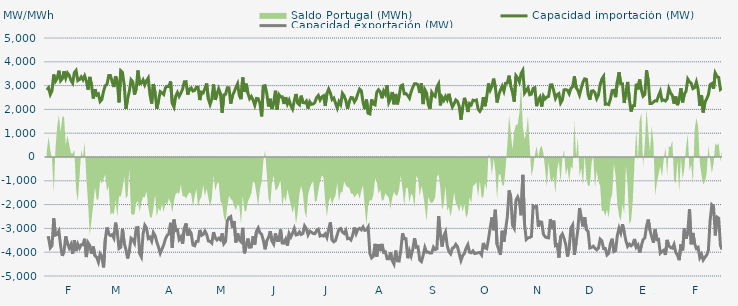
| Category | Capacidad importación (MW) | Capacidad exportación (MW) |
|---|---|---|
| 0 | 2816.458 | -3403.125 |
| 1900-01-01 | 2908.75 | -3388.125 |
| 1900-01-02 | 2628.458 | -3817.5 |
| 1900-01-03 | 2784.5 | -3729.375 |
| 1900-01-04 | 3466.875 | -2575.375 |
| 1900-01-05 | 3180 | -3284.375 |
| 1900-01-06 | 3301.25 | -3251.25 |
| 1900-01-07 | 3624.375 | -3114.375 |
| 1900-01-08 | 3203.333 | -3733.125 |
| 1900-01-09 | 3288.125 | -4155 |
| 1900-01-10 | 3606.25 | -3943.125 |
| 1900-01-11 | 3313.75 | -3335.625 |
| 1900-01-12 | 3531.417 | -3646.875 |
| 1900-01-13 | 3433.125 | -3826.875 |
| 1900-01-14 | 3223.542 | -3673.333 |
| 1900-01-15 | 3103.75 | -4066.875 |
| 1900-01-16 | 3546.25 | -3496.875 |
| 1900-01-17 | 3638.5 | -3952.5 |
| 1900-01-18 | 3210 | -3661.875 |
| 1900-01-19 | 3255.417 | -3826.875 |
| 1900-01-20 | 3367.5 | -3690 |
| 1900-01-21 | 3244.5 | -3684.375 |
| 1900-01-22 | 3411.458 | -3435 |
| 1900-01-23 | 3192.708 | -4203.75 |
| 1900-01-24 | 2825 | -3605.625 |
| 1900-01-25 | 3365.667 | -3718.625 |
| 1900-01-26 | 3014.375 | -4063.125 |
| 1900-01-27 | 2458.292 | -3762 |
| 1900-01-28 | 2845.5 | -4151.25 |
| 1900-01-29 | 2597.292 | -4215 |
| 1900-01-30 | 2650.375 | -4415.625 |
| 1900-01-31 | 2331.042 | -4066.875 |
| 1900-02-01 | 2415.625 | -4185 |
| 1900-02-02 | 2763.875 | -4638.75 |
| 1900-02-03 | 2996.042 | -3465 |
| 1900-02-04 | 3054.375 | -2960.625 |
| 1900-02-05 | 3421.875 | -3238.875 |
| 1900-02-06 | 3422.25 | -3301.458 |
| 1900-02-07 | 3168.75 | -3257.708 |
| 1900-02-08 | 2940.75 | -3407.5 |
| 1900-02-09 | 3391.875 | -2758.75 |
| 1900-02-10 | 3159.375 | -3175.208 |
| 1900-02-11 | 2294.792 | -3843.75 |
| 1900-02-12 | 3620.625 | -3793.125 |
| 1900-02-13 | 3550.208 | -3016.875 |
| 1900-02-14 | 3036.458 | -3616.875 |
| 1900-02-15 | 2023.333 | -3886.25 |
| 1900-02-16 | 2440.208 | -4263.75 |
| 1900-02-17 | 2764.167 | -3943.125 |
| 1900-02-18 | 3245.625 | -3410.667 |
| 1900-02-19 | 3161.25 | -3470.625 |
| 1900-02-20 | 2621.458 | -3614.625 |
| 1900-02-21 | 2861.25 | -2975.958 |
| 1900-02-22 | 3635.217 | -2962.391 |
| 1900-02-23 | 3071.083 | -4052.75 |
| 1900-02-24 | 3103.625 | -4196.25 |
| 1900-02-25 | 3238.125 | -3235.75 |
| 1900-02-26 | 3031.875 | -2868.708 |
| 1900-02-27 | 3202.5 | -2981.292 |
| 1900-02-28 | 3320.625 | -3422.292 |
| 1900-02-28 | 2615.625 | -3370.417 |
| 1900-03-01 | 2244.375 | -3535.625 |
| 1900-03-02 | 3067.5 | -3176.25 |
| 1900-03-03 | 2692.458 | -3306.875 |
| 1900-03-04 | 2025 | -3576.042 |
| 1900-03-05 | 2373.833 | -3795 |
| 1900-03-06 | 2750.458 | -4045 |
| 1900-03-07 | 2704.167 | -3868.417 |
| 1900-03-08 | 2628.75 | -3691.667 |
| 1900-03-09 | 2910 | -3448.125 |
| 1900-03-10 | 2971.875 | -3293.375 |
| 1900-03-11 | 2958.5 | -3229.167 |
| 1900-03-12 | 3174.375 | -2764.583 |
| 1900-03-13 | 2253.75 | -3813.75 |
| 1900-03-14 | 2100 | -2628.667 |
| 1900-03-15 | 2557.5 | -3088.333 |
| 1900-03-16 | 2713.125 | -3062.25 |
| 1900-03-17 | 2546.875 | -3463.625 |
| 1900-03-18 | 2686.458 | -3359.458 |
| 1900-03-19 | 2850 | -3646.042 |
| 1900-03-20 | 3159.375 | -2992.292 |
| 1900-03-21 | 3166.875 | -2793.125 |
| 1900-03-22 | 2613.75 | -3298.833 |
| 1900-03-23 | 2857.5 | -3089.625 |
| 1900-03-24 | 2903.875 | -3210.125 |
| 1900-03-25 | 2772 | -3696.792 |
| 1900-03-26 | 2797.5 | -3731.25 |
| 1900-03-27 | 2930.625 | -3545.625 |
| 1900-03-28 | 2932.5 | -3541.875 |
| 1900-03-29 | 2390.625 | -3064.167 |
| 1900-03-30 | 2726.25 | -3293.333 |
| 1900-03-31 | 2694.375 | -3252.708 |
| 1900-04-01 | 2878.125 | -3111.875 |
| 1900-04-02 | 3088.125 | -3247.5 |
| 1900-04-03 | 2435.625 | -3528.958 |
| 1900-04-04 | 2206.875 | -3547.708 |
| 1900-04-05 | 2435.625 | -3618.75 |
| 1900-04-06 | 3046.875 | -3157.917 |
| 1900-04-07 | 2400 | -3406.875 |
| 1900-04-08 | 2640 | -3488.125 |
| 1900-04-09 | 2866.875 | -3413.542 |
| 1900-04-10 | 2675.625 | -3486.458 |
| 1900-04-11 | 1861.25 | -3211.667 |
| 1900-04-12 | 2611.875 | -3644.375 |
| 1900-04-13 | 2638.125 | -3547.083 |
| 1900-04-14 | 2906.25 | -2688.333 |
| 1900-04-15 | 2904.375 | -2549.583 |
| 1900-04-16 | 2240.625 | -2502.083 |
| 1900-04-17 | 2576.25 | -2981.667 |
| 1900-04-18 | 2732.25 | -2689.375 |
| 1900-04-19 | 2919.375 | -3586.875 |
| 1900-04-20 | 3078.75 | -3206.25 |
| 1900-04-21 | 2587.5 | -3481.875 |
| 1900-04-22 | 2430 | -3560.625 |
| 1900-04-23 | 3341.25 | -2977.542 |
| 1900-04-24 | 2733.75 | -4046.25 |
| 1900-04-25 | 3080.625 | -3725.417 |
| 1900-04-26 | 2681.25 | -3429.375 |
| 1900-04-27 | 2448.75 | -3793.125 |
| 1900-04-28 | 2544.125 | -3778.125 |
| 1900-04-29 | 2394.958 | -3328.125 |
| 1900-04-30 | 2175 | -3678.75 |
| 1900-05-01 | 2461.167 | -3117.375 |
| 1900-05-02 | 2448.75 | -2981.542 |
| 1900-05-03 | 2255.042 | -3185.833 |
| 1900-05-04 | 1708.042 | -3250.208 |
| 1900-05-05 | 2981.25 | -3508.125 |
| 1900-05-06 | 2998.125 | -3877.5 |
| 1900-05-07 | 2664.375 | -3519.375 |
| 1900-05-08 | 2124.375 | -3382.5 |
| 1900-05-09 | 2446.875 | -3115.792 |
| 1900-05-10 | 2015.417 | -3534.375 |
| 1900-05-11 | 2289.375 | -3658.125 |
| 1900-05-12 | 2784.375 | -3211.083 |
| 1900-05-13 | 1993.125 | -3504.792 |
| 1900-05-14 | 2624.875 | -3506.458 |
| 1900-05-15 | 2523.75 | -3042.583 |
| 1900-05-16 | 2531.25 | -3613.125 |
| 1900-05-17 | 2229.583 | -3620.625 |
| 1900-05-18 | 2515.875 | -3455.625 |
| 1900-05-19 | 2227.5 | -3723.75 |
| 1900-05-20 | 2388.375 | -3217.458 |
| 1900-05-21 | 2157.875 | -3361.542 |
| 1900-05-22 | 2014.583 | -3202.708 |
| 1900-05-23 | 2357.917 | -3006.583 |
| 1900-05-24 | 2647.75 | -3275.625 |
| 1900-05-25 | 2259.375 | -3258.75 |
| 1900-05-26 | 2191.875 | -3148.125 |
| 1900-05-27 | 2578.125 | -3256.875 |
| 1900-05-28 | 2289.375 | -3211.875 |
| 1900-05-29 | 2272.917 | -2898.25 |
| 1900-05-30 | 2349.75 | -3012.25 |
| 1900-05-31 | 2034.167 | -3270 |
| 1900-06-01 | 2319.375 | -3116.25 |
| 1900-06-02 | 2214.375 | -3159.375 |
| 1900-06-03 | 2229.167 | -3217.5 |
| 1900-06-04 | 2296.875 | -3223.125 |
| 1900-06-05 | 2497.5 | -3080.208 |
| 1900-06-06 | 2585.5 | -3034.292 |
| 1900-06-07 | 2394.375 | -3318.75 |
| 1900-06-08 | 2520 | -3286.875 |
| 1900-06-09 | 2570.625 | -3320.625 |
| 1900-06-10 | 2145 | -3229.583 |
| 1900-06-11 | 2673.75 | -3384.375 |
| 1900-06-12 | 2855.625 | -3040.333 |
| 1900-06-13 | 2689.875 | -2741.708 |
| 1900-06-14 | 2413.125 | -3485.625 |
| 1900-06-15 | 2476.875 | -3564.375 |
| 1900-06-16 | 2258.75 | -3510 |
| 1900-06-17 | 2056.875 | -3258.75 |
| 1900-06-18 | 2326.875 | -3036.667 |
| 1900-06-19 | 2203.125 | -3003.75 |
| 1900-06-20 | 2675.333 | -3153.417 |
| 1900-06-21 | 2572.5 | -3211.875 |
| 1900-06-22 | 2368.125 | -3082.917 |
| 1900-06-23 | 2032.5 | -3433.125 |
| 1900-06-24 | 2340 | -3418.125 |
| 1900-06-25 | 2499.375 | -3485.625 |
| 1900-06-26 | 2488.125 | -3277.5 |
| 1900-06-27 | 2317.5 | -2963.167 |
| 1900-06-28 | 2431.875 | -3217.5 |
| 1900-06-29 | 2668.125 | -3039.375 |
| 1900-06-30 | 2855.625 | -2998.125 |
| 1900-07-01 | 2778.75 | -3061.667 |
| 1900-07-02 | 2311.875 | -2941.042 |
| 1900-07-03 | 2010 | -3084.375 |
| 1900-07-04 | 2411.25 | -3065.625 |
| 1900-07-05 | 1837.917 | -2945.625 |
| 1900-07-06 | 1809.167 | -4055.625 |
| 1900-07-07 | 2419.792 | -4241.25 |
| 1900-07-08 | 2227.5 | -4173.75 |
| 1900-07-09 | 2191.875 | -3648.75 |
| 1900-07-10 | 2715 | -4183.125 |
| 1900-07-11 | 2826.625 | -3667.292 |
| 1900-07-12 | 2745 | -3950.625 |
| 1900-07-13 | 2467.5 | -3652.625 |
| 1900-07-14 | 2771.25 | -4006.875 |
| 1900-07-15 | 2640 | -3980.625 |
| 1900-07-16 | 3016.875 | -4271.25 |
| 1900-07-17 | 2292.292 | -4271.25 |
| 1900-07-18 | 2448.75 | -4010.625 |
| 1900-07-19 | 2730 | -4357.5 |
| 1900-07-20 | 2214.75 | -4501.875 |
| 1900-07-21 | 2650.208 | -3931.667 |
| 1900-07-22 | 2212.5 | -4361.25 |
| 1900-07-23 | 2565 | -4370.625 |
| 1900-07-24 | 2988.75 | -3920.625 |
| 1900-07-25 | 3024.375 | -3204.083 |
| 1900-07-26 | 2656.875 | -3437.708 |
| 1900-07-27 | 2664.375 | -3437.5 |
| 1900-07-28 | 2587.5 | -4254.375 |
| 1900-07-29 | 2473.125 | -3939.583 |
| 1900-07-30 | 2737.5 | -4156.875 |
| 1900-07-31 | 2932.5 | -3862.5 |
| 1900-08-01 | 3080.625 | -3412.708 |
| 1900-08-02 | 3078.125 | -3793.125 |
| 1900-08-03 | 3031.25 | -3776.25 |
| 1900-08-04 | 2689.875 | -4331.25 |
| 1900-08-05 | 3104.042 | -4396.875 |
| 1900-08-06 | 2223.25 | -4126.875 |
| 1900-08-07 | 2830.208 | -3799.583 |
| 1900-08-08 | 2694.375 | -3999.792 |
| 1900-08-09 | 2193.542 | -3994.167 |
| 1900-08-10 | 2019.375 | -4039.792 |
| 1900-08-11 | 2710.792 | -4026.667 |
| 1900-08-12 | 2589.292 | -3790.625 |
| 1900-08-13 | 2542.5 | -3888.75 |
| 1900-08-14 | 2943.75 | -3856.875 |
| 1900-08-15 | 3076.875 | -2486 |
| 1900-08-16 | 2169.583 | -3271.875 |
| 1900-08-17 | 2510.875 | -3762.292 |
| 1900-08-18 | 2379.375 | -3315.625 |
| 1900-08-19 | 2548.125 | -3149.875 |
| 1900-08-20 | 2405.625 | -3725.625 |
| 1900-08-21 | 2655.792 | -3978.75 |
| 1900-08-22 | 2338.917 | -4070.625 |
| 1900-08-23 | 2100.75 | -3836.25 |
| 1900-08-24 | 2239.583 | -3791.25 |
| 1900-08-25 | 2398.417 | -3671.25 |
| 1900-08-26 | 2333.375 | -3772.5 |
| 1900-08-27 | 2128.125 | -4065 |
| 1900-08-28 | 1568.375 | -4348.125 |
| 1900-08-29 | 2080.083 | -4146.125 |
| 1900-08-30 | 2486.208 | -4052.083 |
| 1900-08-31 | 2275.5 | -3824.583 |
| 1900-09-01 | 1891.708 | -3681.25 |
| 1900-09-02 | 2248.292 | -4001.25 |
| 1900-09-03 | 2190.75 | -4023.75 |
| 1900-09-04 | 2386.583 | -3945 |
| 1900-09-05 | 2366.708 | -4057.5 |
| 1900-09-06 | 2393.375 | -4042.25 |
| 1900-09-07 | 2007.375 | -4017.708 |
| 1900-09-08 | 1918.833 | -4016.25 |
| 1900-09-09 | 2042.417 | -4115.625 |
| 1900-09-10 | 2516.25 | -3611.25 |
| 1900-09-11 | 2132.708 | -3815.625 |
| 1900-09-12 | 2530.208 | -3849.375 |
| 1900-09-13 | 3090 | -3459.375 |
| 1900-09-14 | 2808.75 | -2974.875 |
| 1900-09-15 | 2978.125 | -2539.125 |
| 1900-09-16 | 3292.5 | -3075.208 |
| 1900-09-17 | 2935 | -2217.083 |
| 1900-09-18 | 2289.583 | -3673.125 |
| 1900-09-19 | 2619.375 | -3890.625 |
| 1900-09-20 | 2814.792 | -4110 |
| 1900-09-21 | 2979.375 | -3099.375 |
| 1900-09-22 | 2767.5 | -3556.875 |
| 1900-09-23 | 3099.375 | -3031.875 |
| 1900-09-24 | 3111.25 | -2508.75 |
| 1900-09-25 | 3418.125 | -1406.875 |
| 1900-09-26 | 2979.6 | -1681.6 |
| 1900-09-27 | 2705.333 | -2868.75 |
| 1900-09-28 | 2324.458 | -2999 |
| 1900-09-29 | 3414.375 | -1815.417 |
| 1900-09-30 | 3313.125 | -1677.917 |
| 1900-10-01 | 3144.583 | -1882.667 |
| 1900-10-02 | 3511.875 | -2448.75 |
| 1900-10-03 | 3639.375 | -750.708 |
| 1900-10-04 | 2688.958 | -2820 |
| 1900-10-05 | 2797.542 | -3465 |
| 1900-10-06 | 2902.5 | -3399.375 |
| 1900-10-07 | 2618.042 | -3382.5 |
| 1900-10-08 | 2643.417 | -3336.125 |
| 1900-10-09 | 2878.125 | -2058.75 |
| 1900-10-10 | 2915 | -2101.875 |
| 1900-10-11 | 2137.708 | -2068.125 |
| 1900-10-12 | 2411.042 | -2928.75 |
| 1900-10-13 | 2524.375 | -2722.5 |
| 1900-10-14 | 2118.542 | -2739.375 |
| 1900-10-15 | 2559.458 | -3244.292 |
| 1900-10-16 | 2440.833 | -3354.75 |
| 1900-10-17 | 2521.167 | -3387.25 |
| 1900-10-18 | 2546.333 | -3396.375 |
| 1900-10-19 | 3028.125 | -2606.25 |
| 1900-10-20 | 3031.875 | -3030 |
| 1900-10-21 | 2773.917 | -2675.625 |
| 1900-10-22 | 2465.417 | -3720 |
| 1900-10-23 | 2620.708 | -3684.375 |
| 1900-10-24 | 2665.625 | -4224.375 |
| 1900-10-25 | 2266.875 | -3343.125 |
| 1900-10-26 | 2395.625 | -3230.625 |
| 1900-10-27 | 2820.417 | -3421.875 |
| 1900-10-28 | 2831.667 | -3678.75 |
| 1900-10-29 | 2807.708 | -4181.25 |
| 1900-10-30 | 2656.917 | -3808.125 |
| 1900-10-31 | 2889.375 | -2983.125 |
| 1900-11-01 | 2955.417 | -2856.75 |
| 1900-11-02 | 3390.125 | -4111.875 |
| 1900-11-03 | 2918.167 | -3607.5 |
| 1900-11-04 | 2805 | -3067.5 |
| 1900-11-05 | 2603.792 | -2143.125 |
| 1900-11-06 | 2889.792 | -2566.125 |
| 1900-11-07 | 3138.75 | -2918.333 |
| 1900-11-08 | 3284.583 | -2531.167 |
| 1900-11-09 | 3266.875 | -3054.375 |
| 1900-11-10 | 2630.625 | -3127.125 |
| 1900-11-11 | 2410.625 | -3825 |
| 1900-11-12 | 2771.375 | -3800.625 |
| 1900-11-13 | 2785.375 | -3746.25 |
| 1900-11-14 | 2693.917 | -3833.125 |
| 1900-11-15 | 2453.958 | -3898.125 |
| 1900-11-16 | 2603.042 | -3832.458 |
| 1900-11-17 | 3040.208 | -3455.125 |
| 1900-11-18 | 3274.75 | -3527.125 |
| 1900-11-19 | 3387 | -3843.75 |
| 1900-11-20 | 2216.667 | -3847.5 |
| 1900-11-21 | 2229.75 | -4117.5 |
| 1900-11-22 | 2201.625 | -4044.375 |
| 1900-11-23 | 2438.958 | -3630 |
| 1900-11-24 | 2792.375 | -3435 |
| 1900-11-25 | 2803.958 | -3975 |
| 1900-11-26 | 2513.542 | -3933.75 |
| 1900-11-27 | 3165 | -3294.375 |
| 1900-11-28 | 3560.625 | -2987.875 |
| 1900-11-29 | 3075.25 | -3193.125 |
| 1900-11-30 | 3073.417 | -2827.208 |
| 1900-12-01 | 2270.625 | -3162.75 |
| 1900-12-02 | 2727.5 | -3519.375 |
| 1900-12-03 | 3154.417 | -3755.625 |
| 1900-12-04 | 2418.792 | -3661.875 |
| 1900-12-05 | 1908.75 | -3729.375 |
| 1900-12-06 | 2155 | -3669.625 |
| 1900-12-07 | 2159.708 | -3444.375 |
| 1900-12-08 | 3076.458 | -3791.25 |
| 1900-12-09 | 2842.292 | -3698.125 |
| 1900-12-10 | 3253.542 | -4020 |
| 1900-12-11 | 2809.042 | -3716.25 |
| 1900-12-12 | 2558.833 | -3474.375 |
| 1900-12-13 | 2631.875 | -3401.25 |
| 1900-12-14 | 3639.375 | -2911.875 |
| 1900-12-15 | 3192.292 | -2627.375 |
| 1900-12-16 | 2248.167 | -3073.125 |
| 1900-12-17 | 2244.375 | -3343.125 |
| 1900-12-18 | 2309.583 | -3596.625 |
| 1900-12-19 | 2366.167 | -3043.125 |
| 1900-12-20 | 2354.167 | -3474.375 |
| 1900-12-21 | 2578.958 | -3457.5 |
| 1900-12-22 | 2753.5 | -4040.625 |
| 1900-12-23 | 2372.208 | -3969.375 |
| 1900-12-24 | 2398.458 | -3918.75 |
| 1900-12-25 | 2354.167 | -4115.625 |
| 1900-12-26 | 2437.625 | -3484.625 |
| 1900-12-27 | 2874.167 | -3740.625 |
| 1900-12-28 | 2690.583 | -3803.75 |
| 1900-12-29 | 2590.875 | -3828.75 |
| 1900-12-30 | 2241.875 | -3671.25 |
| 1900-12-31 | 2542.292 | -4008.75 |
| 1901-01-01 | 2178.333 | -4123.125 |
| 1901-01-02 | 2426.208 | -4335 |
| 1901-01-03 | 2888.333 | -3675 |
| 1901-01-04 | 2294.25 | -3925 |
| 1901-01-05 | 2647.5 | -3010.625 |
| 1901-01-06 | 2762.083 | -3433.917 |
| 1901-01-07 | 3275.625 | -3162.875 |
| 1901-01-08 | 3155.625 | -2184.667 |
| 1901-01-09 | 3101.25 | -3667.5 |
| 1901-01-10 | 2874.417 | -3191.25 |
| 1901-01-11 | 2917.708 | -3645 |
| 1901-01-12 | 3152.792 | -3847.5 |
| 1901-01-13 | 2842.417 | -3796.875 |
| 1901-01-14 | 2144.167 | -4231.875 |
| 1901-01-15 | 2593.958 | -4093.125 |
| 1901-01-16 | 1870.625 | -4327.5 |
| 1901-01-17 | 2301.042 | -4213.125 |
| 1901-01-18 | 2442.042 | -4120.875 |
| 1901-01-19 | 2615.292 | -3922.5 |
| 1901-01-20 | 3039.375 | -2676.125 |
| 1901-01-21 | 3086.25 | -2005.625 |
| 1901-01-22 | 2871.042 | -2072.667 |
| 1901-01-23 | 3528.75 | -3293.5 |
| 1901-01-24 | 3386.25 | -2523.75 |
| 1901-01-25 | 3343.75 | -2572.708 |
| 1901-01-26 | 2842.25 | -3728.75 |
| 1901-01-27 | 2908.125 | -3885 |